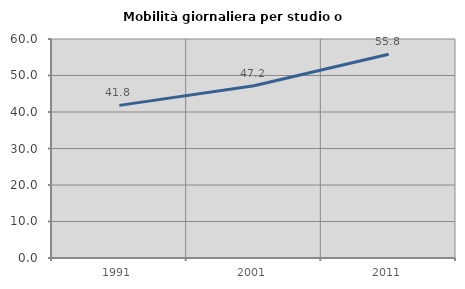
| Category | Mobilità giornaliera per studio o lavoro |
|---|---|
| 1991.0 | 41.814 |
| 2001.0 | 47.206 |
| 2011.0 | 55.818 |